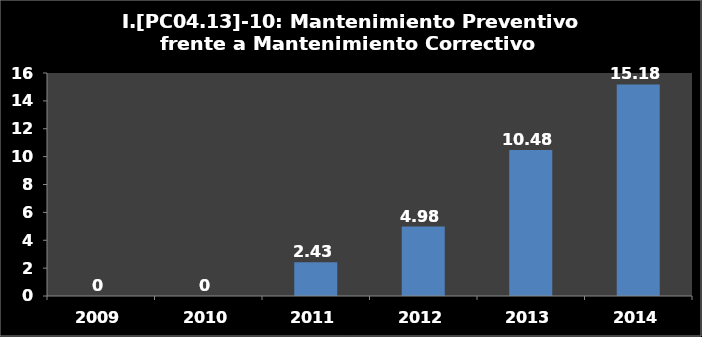
| Category | I.PC04.13-10 |
|---|---|
| 2009.0 | 0 |
| 2010.0 | 0 |
| 2011.0 | 2.43 |
| 2012.0 | 4.98 |
| 2013.0 | 10.48 |
| 2014.0 | 15.18 |